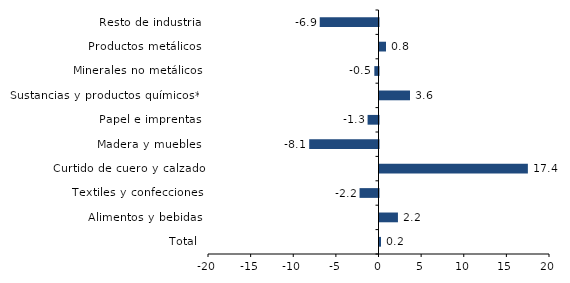
| Category | Series 0 |
|---|---|
| Total | 0.176 |
| Alimentos y bebidas | 2.162 |
| Textiles y confecciones | -2.223 |
| Curtido de cuero y calzado | 17.405 |
| Madera y muebles | -8.131 |
| Papel e imprentas | -1.28 |
| Sustancias y productos químicos** | 3.575 |
| Minerales no metálicos | -0.489 |
| Productos metálicos | 0.763 |
| Resto de industria | -6.894 |